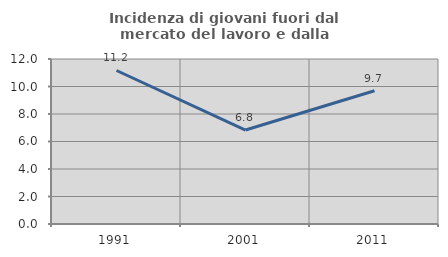
| Category | Incidenza di giovani fuori dal mercato del lavoro e dalla formazione  |
|---|---|
| 1991.0 | 11.164 |
| 2001.0 | 6.832 |
| 2011.0 | 9.695 |